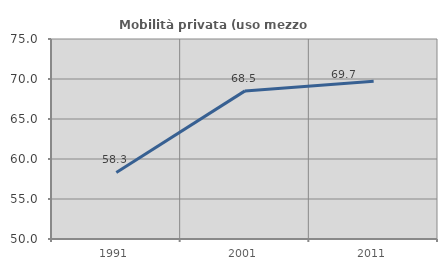
| Category | Mobilità privata (uso mezzo privato) |
|---|---|
| 1991.0 | 58.317 |
| 2001.0 | 68.514 |
| 2011.0 | 69.732 |